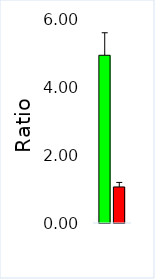
| Category | Control | ASD |
|---|---|---|
| GST:
GLTN | 4.933 | 1.06 |